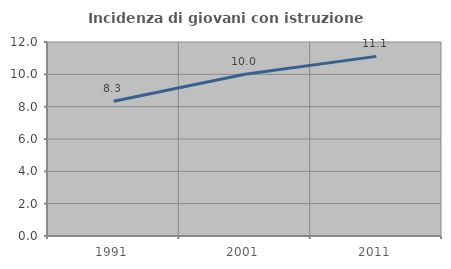
| Category | Incidenza di giovani con istruzione universitaria |
|---|---|
| 1991.0 | 8.333 |
| 2001.0 | 10 |
| 2011.0 | 11.111 |